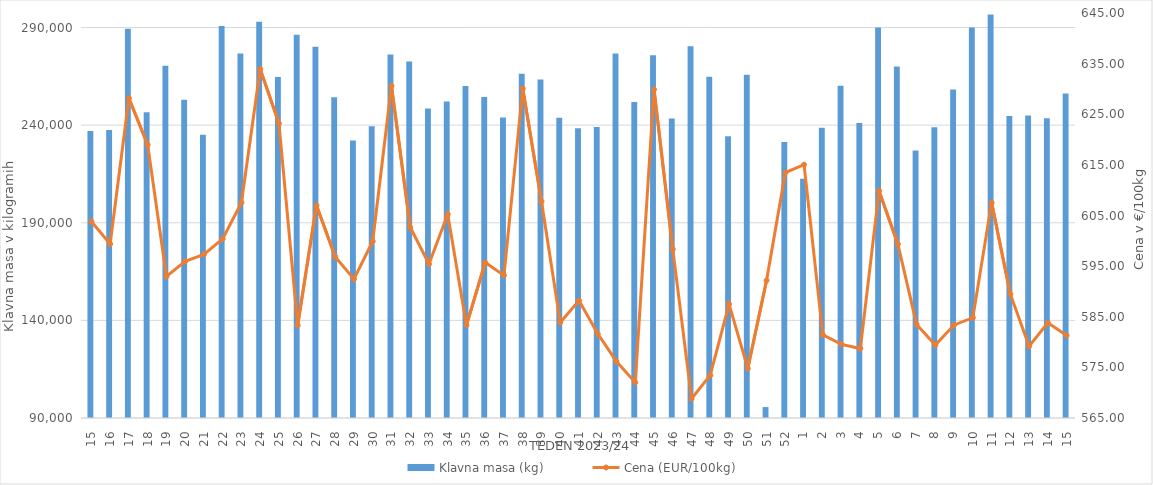
| Category | Klavna masa (kg) |
|---|---|
| 15.0 | 236964 |
| 16.0 | 237552 |
| 17.0 | 289400 |
| 18.0 | 246616 |
| 19.0 | 270374 |
| 20.0 | 252984 |
| 21.0 | 235060 |
| 22.0 | 290816 |
| 23.0 | 276702 |
| 24.0 | 292976 |
| 25.0 | 264669 |
| 26.0 | 286237 |
| 27.0 | 280112 |
| 28.0 | 254336 |
| 29.0 | 232178 |
| 30.0 | 239437 |
| 31.0 | 276163 |
| 32.0 | 272647 |
| 33.0 | 248536 |
| 34.0 | 252050 |
| 35.0 | 260110 |
| 36.0 | 254389 |
| 37.0 | 243933 |
| 38.0 | 266321 |
| 39.0 | 263346 |
| 40.0 | 243765 |
| 41.0 | 238404 |
| 42.0 | 239007 |
| 43.0 | 276684 |
| 44.0 | 251832 |
| 45.0 | 275816 |
| 46.0 | 243425 |
| 47.0 | 280350 |
| 48.0 | 264849 |
| 49.0 | 234308 |
| 50.0 | 265786 |
| 51.0 | 95590 |
| 52.0 | 231370 |
| 1.0 | 212581 |
| 2.0 | 238607 |
| 3.0 | 260140 |
| 4.0 | 241148 |
| 5.0 | 290049 |
| 6.0 | 270025 |
| 7.0 | 227057 |
| 8.0 | 238927 |
| 9.0 | 258215 |
| 10.0 | 290025 |
| 11.0 | 296713 |
| 12.0 | 244673 |
| 13.0 | 244902 |
| 14.0 | 243567 |
| 15.0 | 256150 |